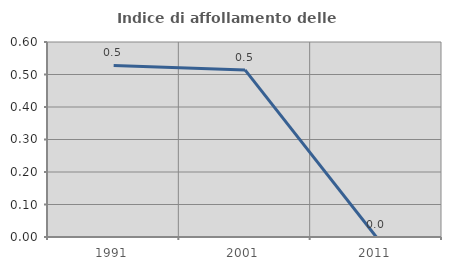
| Category | Indice di affollamento delle abitazioni  |
|---|---|
| 1991.0 | 0.528 |
| 2001.0 | 0.514 |
| 2011.0 | 0 |